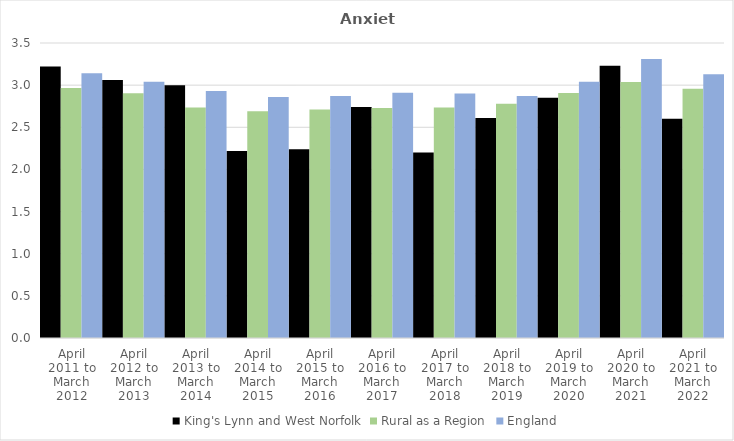
| Category | King's Lynn and West Norfolk | Rural as a Region | England |
|---|---|---|---|
| April 2011 to March 2012 | 3.22 | 2.967 | 3.14 |
| April 2012 to March 2013 | 3.06 | 2.904 | 3.04 |
| April 2013 to March 2014 | 3 | 2.734 | 2.93 |
| April 2014 to March 2015 | 2.22 | 2.691 | 2.86 |
| April 2015 to March 2016 | 2.24 | 2.711 | 2.87 |
| April 2016 to March 2017 | 2.74 | 2.729 | 2.91 |
| April 2017 to March 2018 | 2.2 | 2.736 | 2.9 |
| April 2018 to March 2019 | 2.61 | 2.78 | 2.87 |
| April 2019 to March 2020 | 2.85 | 2.908 | 3.04 |
| April 2020 to March 2021 | 3.23 | 3.036 | 3.31 |
| April 2021 to March 2022 | 2.6 | 2.956 | 3.13 |